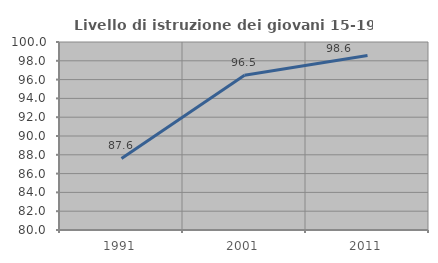
| Category | Livello di istruzione dei giovani 15-19 anni |
|---|---|
| 1991.0 | 87.611 |
| 2001.0 | 96.471 |
| 2011.0 | 98.561 |